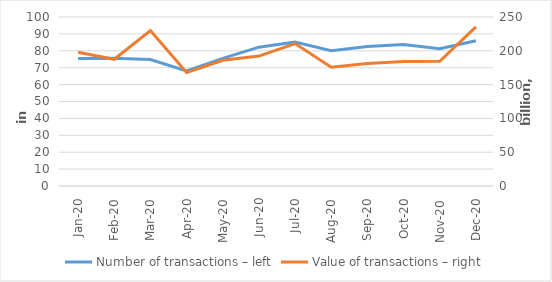
| Category | Number of transactions – left |
|---|---|
| Jan-20 | 75481532 |
| Feb-20 | 75603317 |
| Mar-20 | 74789970 |
| Apr-20 | 68062079 |
| May-20 | 75530360 |
| Jun-20 | 82137656 |
| Jul-20 | 85178442 |
| Aug-20 | 80059041 |
| Sep-20 | 82511852 |
| Oct-20 | 83750851 |
| Nov-20 | 81246463 |
| Dec-20 | 85993154 |